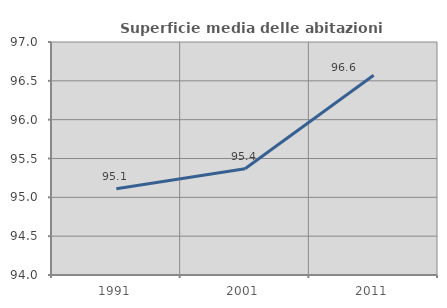
| Category | Superficie media delle abitazioni occupate |
|---|---|
| 1991.0 | 95.11 |
| 2001.0 | 95.369 |
| 2011.0 | 96.573 |